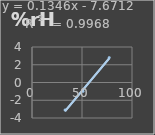
| Category | Humedad |
|---|---|
| 33.1 | -3.1 |
| 51.0 | -1 |
| 77.2 | 2.8 |